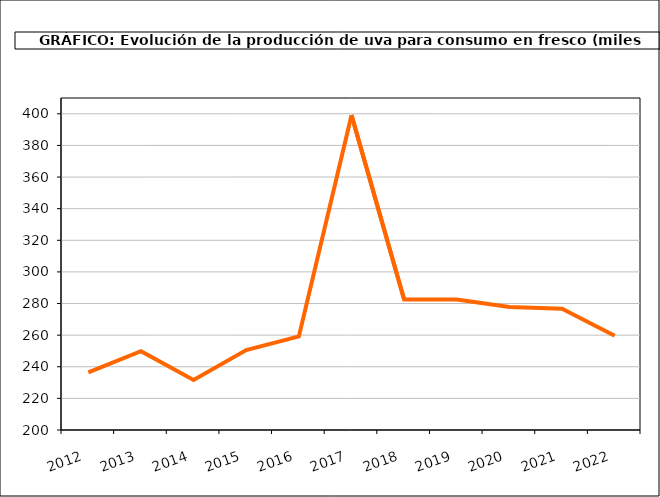
| Category | producción |
|---|---|
| 2012.0 | 236.454 |
| 2013.0 | 249.825 |
| 2014.0 | 231.693 |
| 2015.0 | 250.597 |
| 2016.0 | 259.165 |
| 2017.0 | 399.144 |
| 2018.0 | 282.521 |
| 2019.0 | 282.538 |
| 2020.0 | 277.853 |
| 2021.0 | 276.699 |
| 2022.0 | 259.645 |